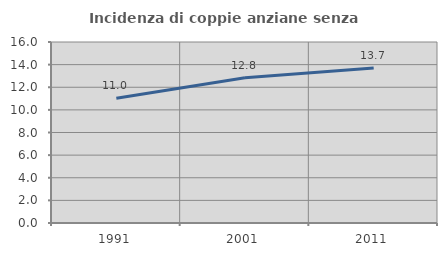
| Category | Incidenza di coppie anziane senza figli  |
|---|---|
| 1991.0 | 11.023 |
| 2001.0 | 12.833 |
| 2011.0 | 13.702 |